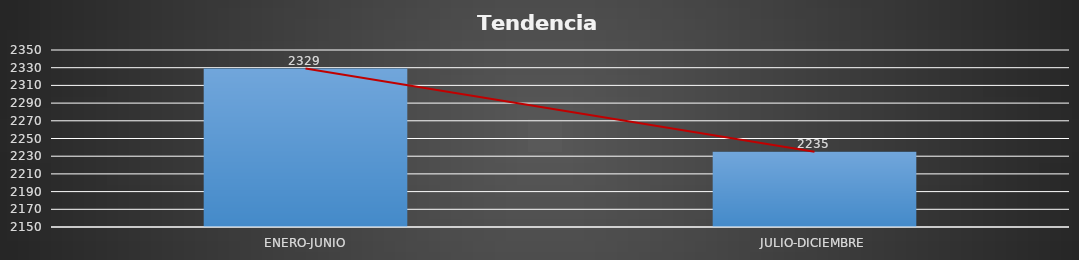
| Category | Series 0 |
|---|---|
| ENERO-JUNIO | 2329 |
| JULIO-DICIEMBRE | 2235 |